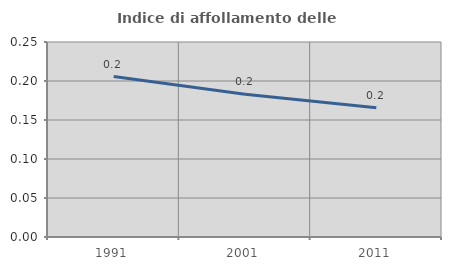
| Category | Indice di affollamento delle abitazioni  |
|---|---|
| 1991.0 | 0.206 |
| 2001.0 | 0.183 |
| 2011.0 | 0.166 |